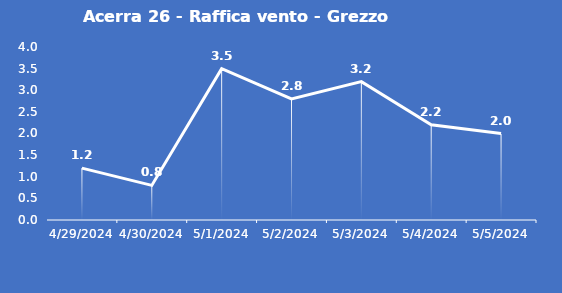
| Category | Acerra 26 - Raffica vento - Grezzo (m/s) |
|---|---|
| 4/29/24 | 1.2 |
| 4/30/24 | 0.8 |
| 5/1/24 | 3.5 |
| 5/2/24 | 2.8 |
| 5/3/24 | 3.2 |
| 5/4/24 | 2.2 |
| 5/5/24 | 2 |